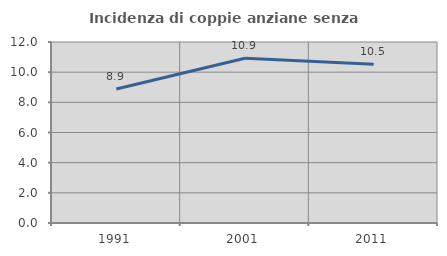
| Category | Incidenza di coppie anziane senza figli  |
|---|---|
| 1991.0 | 8.886 |
| 2001.0 | 10.925 |
| 2011.0 | 10.524 |